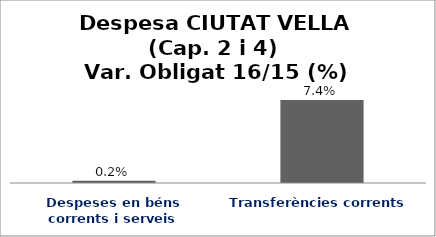
| Category | Series 0 |
|---|---|
| Despeses en béns corrents i serveis | 0.002 |
| Transferències corrents | 0.074 |